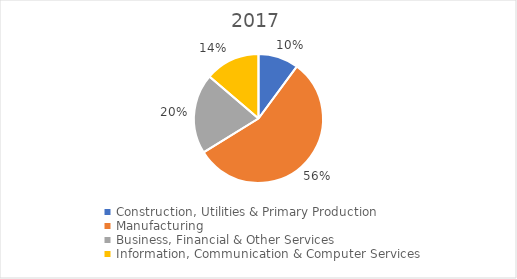
| Category | Series 0 |
|---|---|
| Construction, Utilities & Primary Production  | 0.101 |
| Manufacturing  | 0.561 |
| Business, Financial & Other Services | 0.201 |
| Information, Communication & Computer Services | 0.137 |